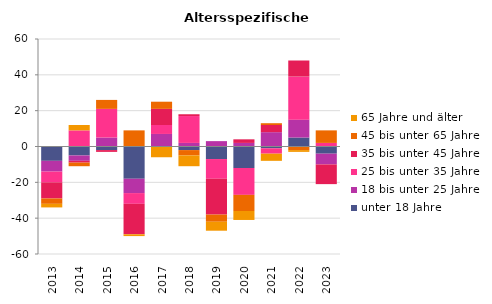
| Category | unter 18 Jahre | 18 bis unter 25 Jahre | 25 bis unter 35 Jahre | 35 bis unter 45 Jahre | 45 bis unter 65 Jahre | 65 Jahre und älter |
|---|---|---|---|---|---|---|
| 2013.0 | -8 | -6 | -6 | -9 | -3 | -2 |
| 2014.0 | -5 | -3 | 9 | -1 | -2 | 3 |
| 2015.0 | -2 | 5 | 16 | -1 | 5 | 0 |
| 2016.0 | -18 | -8 | -6 | -17 | 9 | -1 |
| 2017.0 | 0 | 7 | 5 | 9 | 4 | -6 |
| 2018.0 | -2 | 2 | 15 | 1 | -3 | -6 |
| 2019.0 | -7 | 3 | -11 | -20 | -4 | -5 |
| 2020.0 | -12 | 2 | -15 | 2 | -9 | -5 |
| 2021.0 | -1 | 8 | -3 | 4 | 1 | -4 |
| 2022.0 | 5 | 10 | 24 | 9 | -2 | -1 |
| 2023.0 | -4 | -6 | 2 | -11 | 7 | 0 |